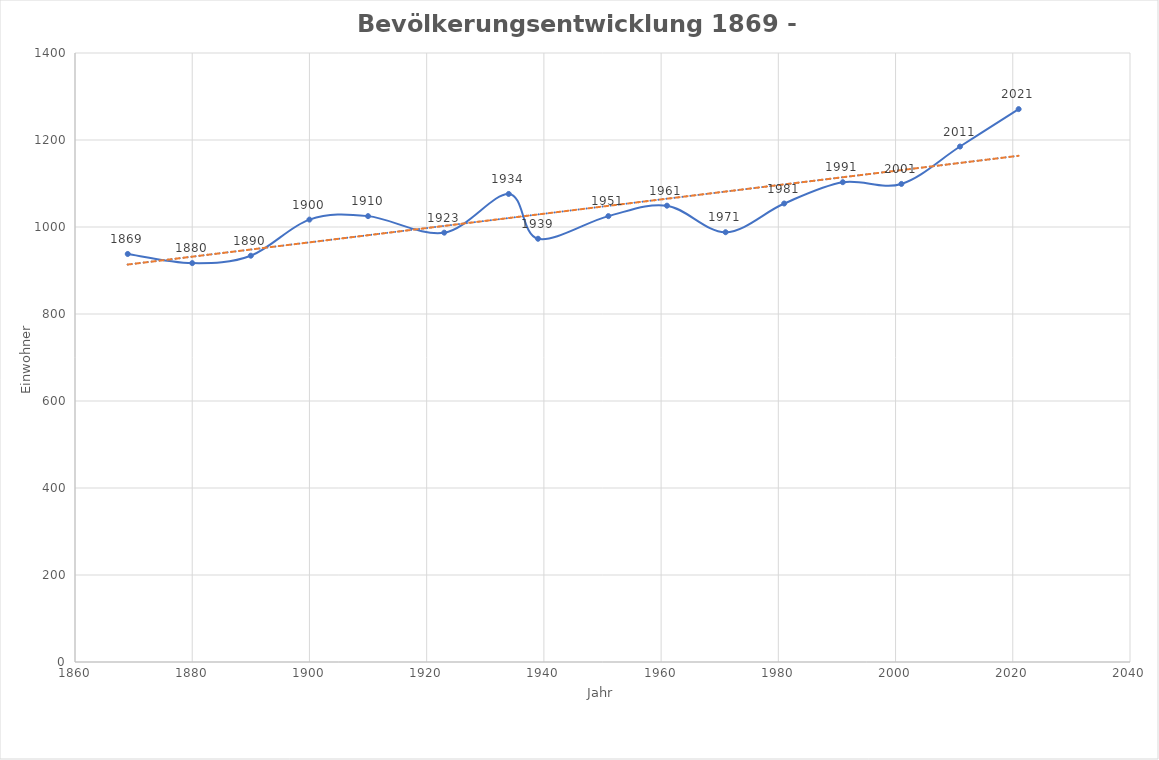
| Category | Anzahl  |
|---|---|
| 1869.0 | 938 |
| 1880.0 | 917 |
| 1890.0 | 934 |
| 1900.0 | 1017 |
| 1910.0 | 1025 |
| 1923.0 | 987 |
| 1934.0 | 1076 |
| 1939.0 | 973 |
| 1951.0 | 1025 |
| 1961.0 | 1049 |
| 1971.0 | 988 |
| 1981.0 | 1054 |
| 1991.0 | 1103 |
| 2001.0 | 1099 |
| 2011.0 | 1185 |
| 2021.0 | 1271 |